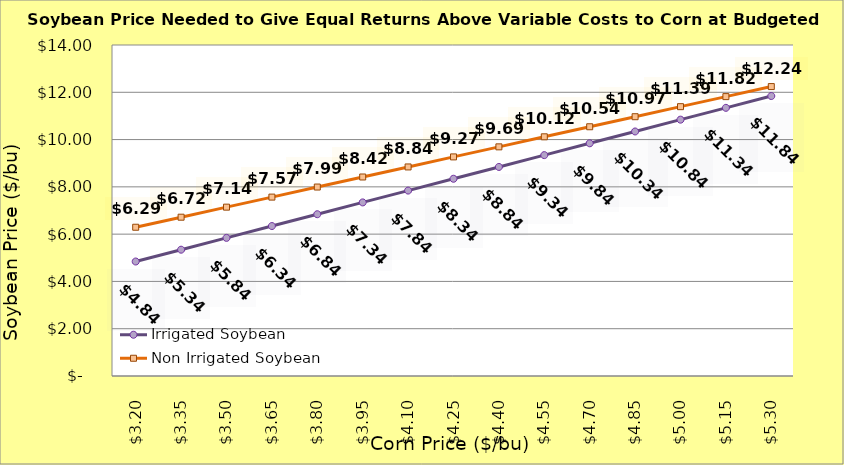
| Category | Irrigated Soybean | Non Irrigated Soybean |
|---|---|---|
| 3.2 | 4.842 | 6.292 |
| 3.35 | 5.342 | 6.717 |
| 3.5 | 5.842 | 7.142 |
| 3.65 | 6.342 | 7.567 |
| 3.8 | 6.842 | 7.992 |
| 3.9499999999999997 | 7.342 | 8.417 |
| 4.1 | 7.842 | 8.842 |
| 4.25 | 8.342 | 9.267 |
| 4.4 | 8.842 | 9.692 |
| 4.550000000000001 | 9.342 | 10.117 |
| 4.700000000000001 | 9.842 | 10.542 |
| 4.850000000000001 | 10.342 | 10.967 |
| 5.000000000000002 | 10.842 | 11.392 |
| 5.150000000000002 | 11.342 | 11.817 |
| 5.3000000000000025 | 11.842 | 12.242 |